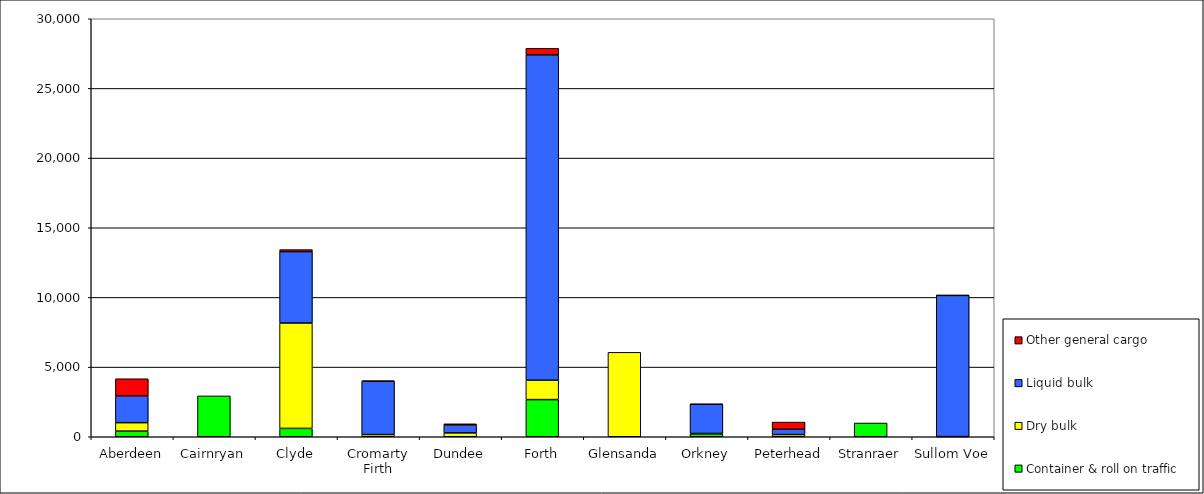
| Category | Container & roll on traffic | Dry bulk | Liquid bulk | Other general cargo |
|---|---|---|---|---|
| Aberdeen | 405 | 606 | 1922 | 1231 |
| Cairnryan | 2932 | 0 | 0 | 0 |
| Clyde | 599 | 7564 | 5124 | 144 |
| Cromarty Firth | 0 | 159 | 3821 | 41 |
| Dundee | 0 | 277 | 571 | 81 |
| Forth | 2666 | 1392 | 23353 | 466 |
| Glensanda | 0 | 6060 | 0 | 0 |
| Orkney | 211 | 25 | 2095 | 13 |
| Peterhead | 0 | 158 | 390 | 506 |
| Stranraer | 986 | 0 | 0 | 0 |
| Sullom Voe | 0 | 12 | 10134 | 7 |